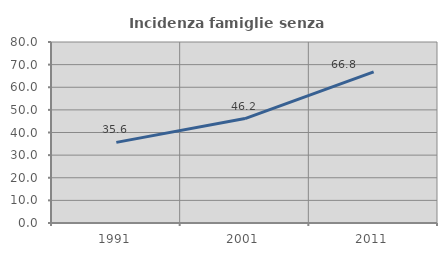
| Category | Incidenza famiglie senza nuclei |
|---|---|
| 1991.0 | 35.632 |
| 2001.0 | 46.154 |
| 2011.0 | 66.829 |